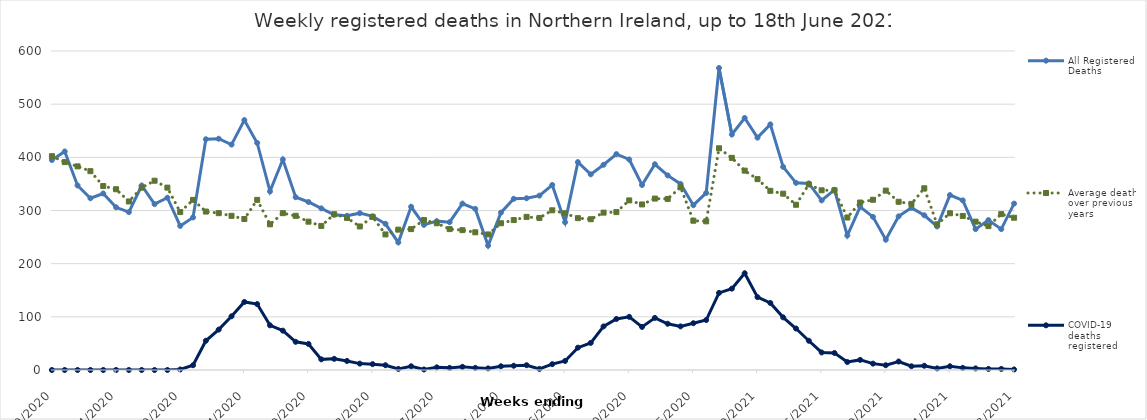
| Category | All Registered Deaths | Average deaths over previous 5 years | COVID-19 deaths registered |
|---|---|---|---|
| 1/10/20 | 395 | 402.2 | 0 |
| 1/17/20 | 411 | 391 | 0 |
| 1/24/20 | 347 | 383 | 0 |
| 1/31/20 | 323 | 374 | 0 |
| 2/7/20 | 332 | 346 | 0 |
| 2/14/20 | 306 | 340 | 0 |
| 2/21/20 | 297 | 317 | 0 |
| 2/28/20 | 347 | 343 | 0 |
| 3/6/20 | 312 | 356 | 0 |
| 3/13/20 | 324 | 343 | 0 |
| 3/20/20 | 271 | 297 | 1 |
| 3/27/20 | 287 | 320 | 9 |
| 4/3/20 | 434 | 298 | 55 |
| 4/10/20 | 435 | 295 | 76 |
| 4/17/20 | 424 | 290 | 101 |
| 4/24/20 | 470 | 284 | 128 |
| 5/1/20 | 427 | 320 | 124 |
| 5/8/20 | 336 | 274 | 84 |
| 5/15/20 | 396 | 295 | 74 |
| 5/22/20 | 325 | 290 | 53 |
| 5/29/20 | 316 | 279 | 49 |
| 6/5/20 | 304 | 271 | 20 |
| 6/12/20 | 292 | 293 | 21 |
| 6/19/20 | 290 | 286 | 17 |
| 6/26/20 | 295 | 270 | 12 |
| 7/3/20 | 289 | 288 | 11 |
| 7/10/20 | 275 | 255 | 9 |
| 7/17/20 | 240 | 264 | 2 |
| 7/24/20 | 307 | 265 | 7 |
| 7/31/20 | 273 | 282 | 1 |
| 8/7/20 | 280 | 276 | 5 |
| 8/14/20 | 278 | 265 | 4 |
| 8/21/20 | 313 | 263 | 6 |
| 8/28/20 | 303 | 259 | 4 |
| 9/4/20 | 234 | 255 | 3 |
| 9/11/20 | 296 | 276 | 7 |
| 9/18/20 | 322 | 282 | 8 |
| 9/25/20 | 323 | 288 | 9 |
| 10/2/20 | 328 | 286 | 2 |
| 10/9/20 | 348 | 300.4 | 11 |
| 10/16/20 | 278 | 294.8 | 17 |
| 10/23/20 | 391 | 285.6 | 42 |
| 10/30/20 | 368 | 283.6 | 51 |
| 11/6/20 | 386 | 296 | 82 |
| 11/13/20 | 406 | 297 | 96 |
| 11/20/20 | 396 | 319 | 100 |
| 11/27/20 | 348 | 311.4 | 81 |
| 12/4/20 | 387 | 322.4 | 98 |
| 12/11/20 | 366 | 321.8 | 87 |
| 12/18/20 | 350 | 343.8 | 82 |
| 12/25/20 | 310 | 280.8 | 88 |
| 1/1/21 | 333 | 279.6 | 94 |
| 1/8/21 | 568 | 417 | 145 |
| 1/15/21 | 443 | 399 | 153 |
| 1/22/21 | 474 | 375 | 182 |
| 1/29/21 | 437 | 359 | 137 |
| 2/5/21 | 462 | 337 | 126 |
| 2/12/21 | 382 | 331.6 | 99 |
| 2/19/21 | 352 | 310.8 | 78 |
| 2/26/21 | 351 | 349 | 55 |
| 3/5/21 | 319 | 338 | 33 |
| 3/12/21 | 339 | 338 | 32 |
| 3/19/21 | 253 | 286.8 | 15 |
| 3/26/21 | 307 | 315 | 19 |
| 4/2/21 | 288 | 320.2 | 12 |
| 4/9/21 | 245 | 337.4 | 9 |
| 4/16/21 | 289 | 316.4 | 16 |
| 4/23/21 | 305 | 312.4 | 7 |
| 4/30/21 | 291 | 341.8 | 8 |
| 5/7/21 | 270 | 274 | 3 |
| 5/14/21 | 329 | 294.8 | 7 |
| 5/21/21 | 319 | 289.8 | 4 |
| 5/28/21 | 265 | 279 | 3 |
| 6/4/21 | 282 | 270.6 | 2 |
| 6/11/21 | 265 | 293.2 | 2 |
| 6/18/21 | 313 | 286.4 | 1 |